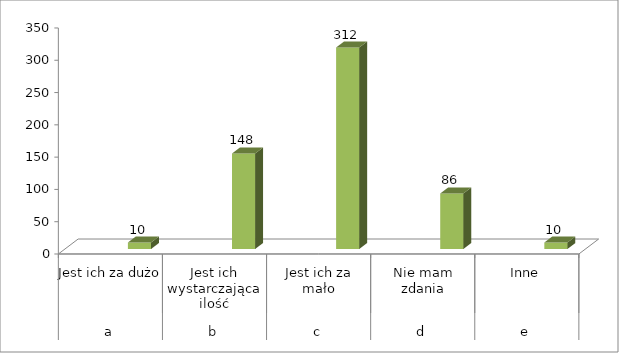
| Category | Series 0 | Series 1 | Series 2 |
|---|---|---|---|
| 0 |  |  | 10 |
| 1 |  |  | 148 |
| 2 |  |  | 312 |
| 3 |  |  | 86 |
| 4 |  |  | 10 |